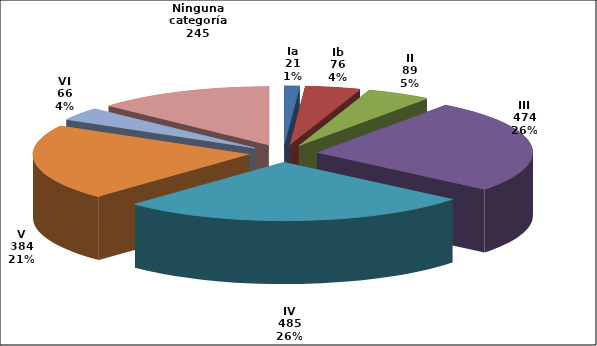
| Category | Series 0 |
|---|---|
| Ia | 21 |
| Ib | 76 |
| II | 89 |
| III | 474 |
| IV | 485 |
| V | 384 |
| VI | 66 |
| Ninguna categoría | 245 |